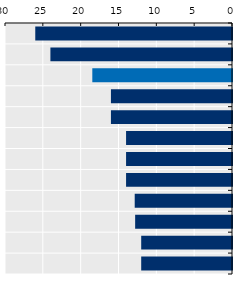
| Category | Length in weeks |
|---|---|
| New Zealand | 26 |
| Viet Nam* | 24 |
| OECD average | 18.461 |
| Mongolia | 16 |
| Singapore | 16 |
| China* | 14 |
| Japan | 14 |
| Thailand* | 14 |
| Korea | 12.857 |
| Malaysia | 12.8 |
| Australia | 12 |
| Indonesia* | 12 |